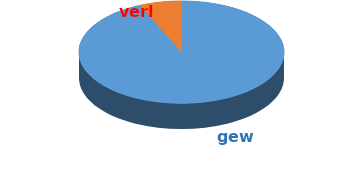
| Category | Series 0 |
|---|---|
| gew | 210 |
| verl | 15 |